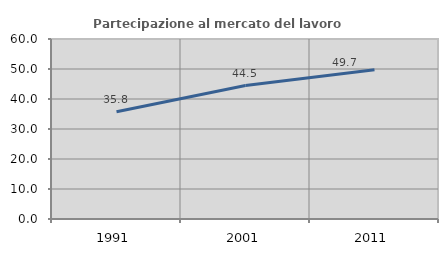
| Category | Partecipazione al mercato del lavoro  femminile |
|---|---|
| 1991.0 | 35.767 |
| 2001.0 | 44.473 |
| 2011.0 | 49.743 |